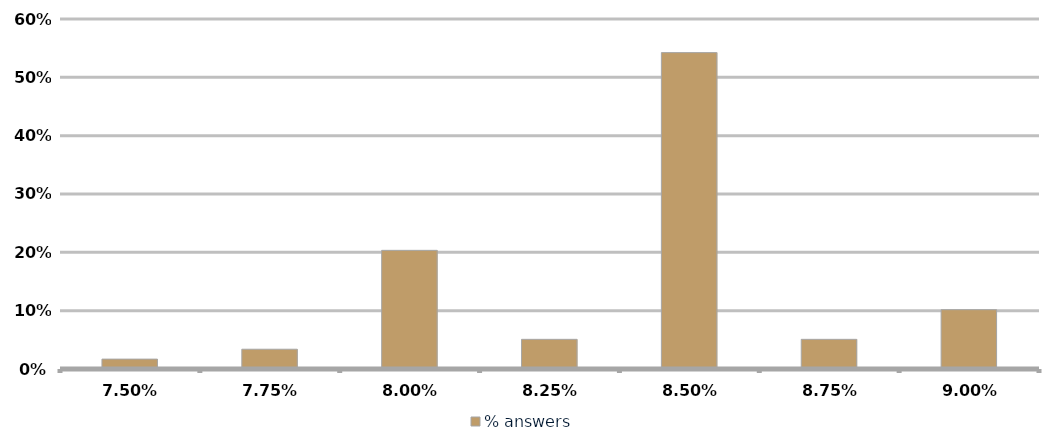
| Category | % answers |
|---|---|
| 0.075 | 0.017 |
| 0.0775 | 0.034 |
| 0.08 | 0.203 |
| 0.0825 | 0.051 |
| 0.085 | 0.542 |
| 0.08750000000000001 | 0.051 |
| 0.09000000000000001 | 0.102 |